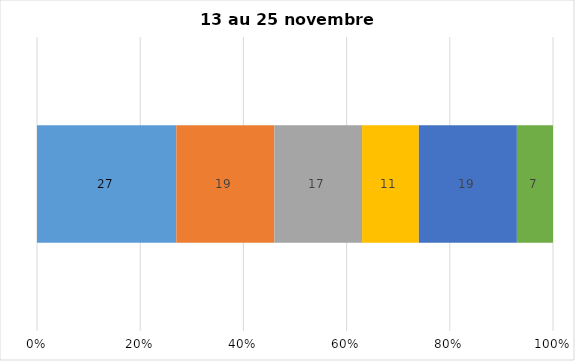
| Category | Plusieurs fois par jour | Une fois par jour | Quelques fois par semaine   | Une fois par semaine ou moins   |  Jamais   |  Je n’utilise pas les médias sociaux |
|---|---|---|---|---|---|---|
| 0 | 27 | 19 | 17 | 11 | 19 | 7 |